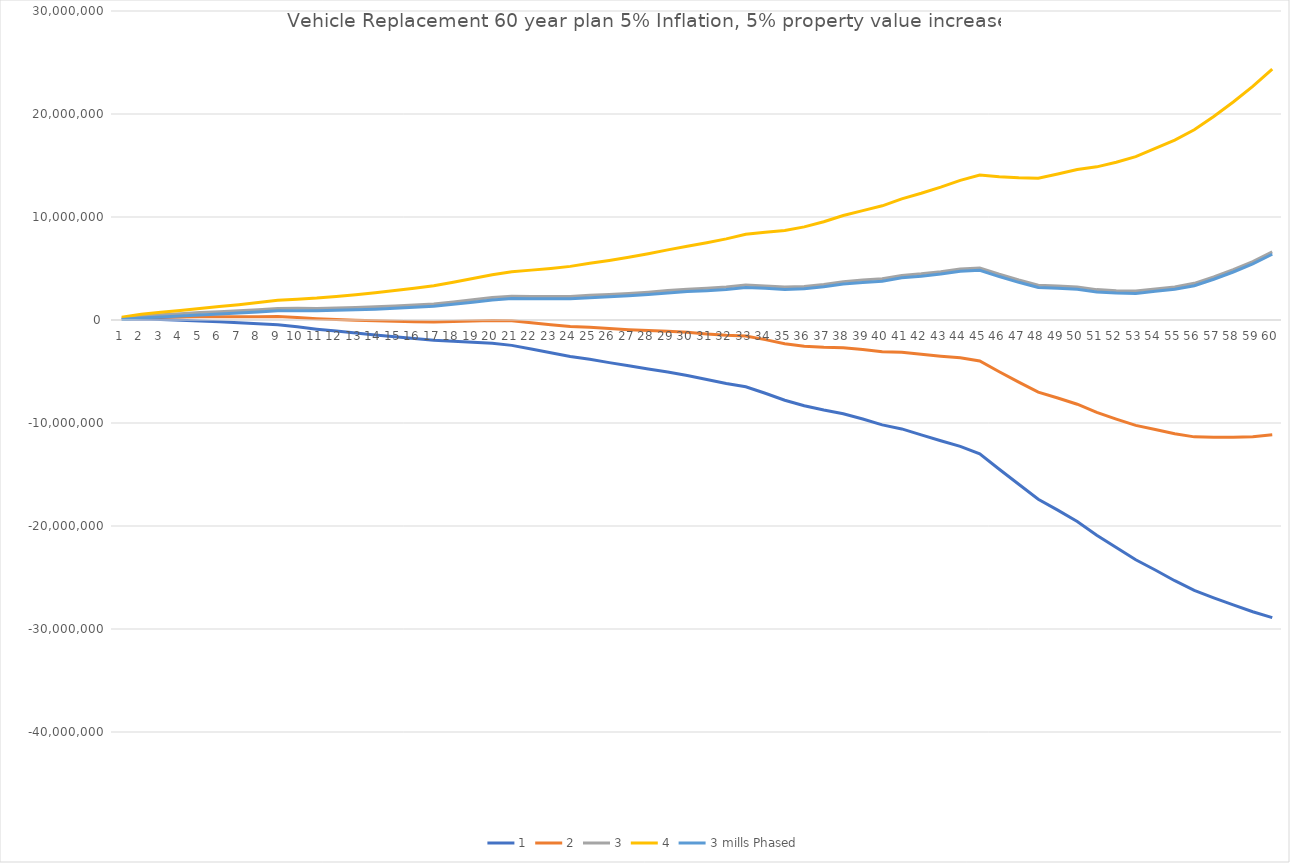
| Category | 1 | 2 | 3 | 4 | 3 mills Phased |
|---|---|---|---|---|---|
| 1.0 | 54603.242 | 129206.484 | 203809.726 | 278412.968 | 54603.242 |
| 2.0 | 105430.614 | 257621.227 | 409811.841 | 562002.455 | 183017.985 |
| 3.0 | 48976.48 | 281857.96 | 514739.441 | 747620.921 | 287945.585 |
| 4.0 | -22837.019 | 293962.963 | 610762.944 | 927562.926 | 383969.089 |
| 5.0 | -91293.777 | 312781.445 | 716856.668 | 1120931.891 | 490062.812 |
| 6.0 | -181259.526 | 313581.947 | 808423.421 | 1303264.894 | 581629.565 |
| 7.0 | -278455.625 | 310782.749 | 900021.124 | 1489259.498 | 673227.268 |
| 8.0 | -371875.848 | 315535.303 | 1002946.455 | 1690357.606 | 776152.599 |
| 9.0 | -461369.16 | 328141.679 | 1117652.519 | 1907163.358 | 890858.663 |
| 10.0 | -661434.485 | 234260.03 | 1129954.546 | 2025649.061 | 903160.69 |
| 11.0 | -887252.462 | 118873.076 | 1124998.613 | 2131124.151 | 898204.758 |
| 12.0 | -1078653.199 | 42320.603 | 1163294.404 | 2284268.205 | 936500.548 |
| 13.0 | -1265460.005 | -25044.009 | 1215371.986 | 2455787.981 | 988578.13 |
| 14.0 | -1447489.123 | -82853.246 | 1281782.631 | 2646418.509 | 1054988.776 |
| 15.0 | -1624549.446 | -130724.892 | 1363099.663 | 2856924.217 | 1136305.807 |
| 16.0 | -1796442.222 | -168261.443 | 1459919.335 | 3088100.114 | 1233125.48 |
| 17.0 | -1971200.748 | -203289.497 | 1564621.755 | 3332533.006 | 1337827.899 |
| 18.0 | -2070367.056 | -157136.113 | 1756094.831 | 3669325.774 | 1529300.975 |
| 19.0 | -2170766.577 | -106403.153 | 1957960.27 | 4022323.693 | 1731166.414 |
| 20.0 | -2265120.798 | -43579.595 | 2177961.607 | 4399502.809 | 1951167.751 |
| 21.0 | -2464189.908 | -79183.815 | 2305822.277 | 4690828.37 | 2079028.421 |
| 22.0 | -2822720.422 | -267710.844 | 2287298.734 | 4842308.312 | 2060504.879 |
| 23.0 | -3185557.797 | -453744.594 | 2278068.61 | 5009881.813 | 2051274.754 |
| 24.0 | -3541323.027 | -625634.053 | 2290054.92 | 5205743.893 | 2063261.064 |
| 25.0 | -3820077.226 | -713157.451 | 2393762.323 | 5500682.097 | 2166968.467 |
| 26.0 | -4139175.193 | -833375.386 | 2472424.422 | 5778224.229 | 2245630.566 |
| 27.0 | -4450317.958 | -937682.917 | 2574952.125 | 6087587.166 | 2348158.269 |
| 28.0 | -4753187.315 | -1025443.63 | 2702300.056 | 6430043.741 | 2475506.2 |
| 29.0 | -5047452.325 | -1095995.651 | 2855461.024 | 6806917.698 | 2628667.168 |
| 30.0 | -5382768.816 | -1198650.633 | 2985467.551 | 7169585.734 | 2758673.695 |
| 31.0 | -5774433.847 | -1348347.694 | 3077738.459 | 7503824.612 | 2850944.603 |
| 32.0 | -6156420.159 | -1478687.318 | 3199045.523 | 7876778.364 | 2972251.667 |
| 33.0 | -6485739.603 | -1546294.207 | 3393151.19 | 8332596.587 | 3166357.334 |
| 34.0 | -7115955.545 | -1904329.091 | 3307297.364 | 8518923.818 | 3080503.508 |
| 35.0 | -7790284.245 | -2295589.491 | 3199105.264 | 8693800.019 | 2972311.408 |
| 36.0 | -8327288.213 | -2538202.426 | 3250883.361 | 9039969.148 | 3024089.505 |
| 37.0 | -8744159.54 | -2648907.079 | 3446345.381 | 9541597.842 | 3219551.525 |
| 38.0 | -9101816.199 | -2688150.398 | 3725515.402 | 10139181.203 | 3498721.547 |
| 39.0 | -9617611.325 | -2872795.65 | 3872020.024 | 10616835.699 | 3645226.169 |
| 40.0 | -10180160.456 | -3090948.912 | 3998262.631 | 11087474.175 | 3771468.776 |
| 41.0 | -10575940.752 | -3128557.505 | 4318825.743 | 11766208.99 | 4092031.887 |
| 42.0 | -11155204.181 | -3335322.361 | 4484559.458 | 12304441.278 | 4257765.603 |
| 43.0 | -11719567.666 | -3512287.331 | 4694993.003 | 12902273.337 | 4468199.147 |
| 44.0 | -12268435.21 | -3658260.421 | 4951914.369 | 13562089.159 | 4725120.513 |
| 45.0 | -13003580.977 | -3974395.954 | 5054789.07 | 14083974.093 | 4827995.214 |
| 46.0 | -14485892.334 | -5020936.668 | 4444018.998 | 13908974.665 | 4217225.143 |
| 47.0 | -15950772.865 | -6032615.73 | 3885541.404 | 13803698.539 | 3658747.549 |
| 48.0 | -17397525.338 | -7008038.676 | 3381447.987 | 13770934.649 | 3154654.131 |
| 49.0 | -18455645.629 | -7575976.259 | 3303693.112 | 14183362.483 | 3076899.256 |
| 50.0 | -19564158.613 | -8174699.225 | 3214760.162 | 14604219.55 | 2987966.307 |
| 51.0 | -20889147.995 | -8969506.99 | 2950134.015 | 14869775.02 | 2723340.159 |
| 52.0 | -22095287.113 | -9624257.226 | 2846772.662 | 15317802.549 | 2619978.806 |
| 53.0 | -23279370.675 | -10234896.351 | 2809577.974 | 15854052.299 | 2582784.118 |
| 54.0 | -24269641.46 | -10628784.921 | 3012071.619 | 16652928.159 | 2785277.763 |
| 55.0 | -25311056.957 | -11049962.913 | 3211131.13 | 17472225.173 | 2984337.274 |
| 56.0 | -26252662.953 | -11346521.906 | 3559619.141 | 18465760.188 | 3332825.285 |
| 57.0 | -26970657.069 | -11393667.138 | 4183322.793 | 19760312.723 | 3956528.937 |
| 58.0 | -27661817.23 | -11387144.46 | 4887528.31 | 21162201.08 | 4660734.455 |
| 59.0 | -28325070.077 | -11324807.154 | 5675455.769 | 22675718.692 | 5448661.913 |
| 60.0 | -28901905.318 | -11147028.636 | 6607848.045 | 24362724.727 | 6381054.19 |